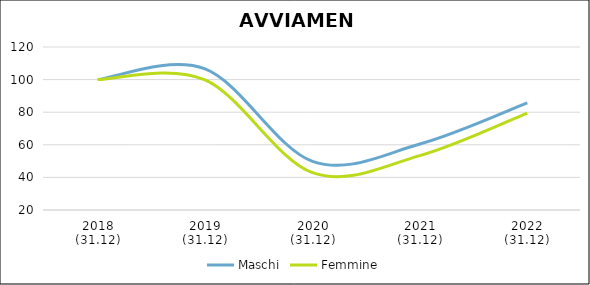
| Category | Maschi | Femmine |
|---|---|---|
| 2018
(31.12) | 100 | 100 |
| 2019
(31.12) | 106.575 | 99.84 |
| 2020
(31.12) | 49.854 | 42.892 |
| 2021
(31.12) | 60.447 | 53.354 |
| 2022
(31.12) | 85.662 | 79.434 |